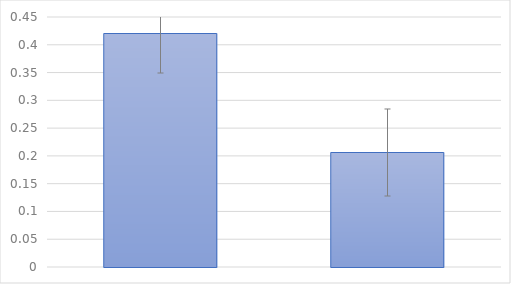
| Category | Series 0 |
|---|---|
| 0 | 0.42 |
| 1 | 0.206 |